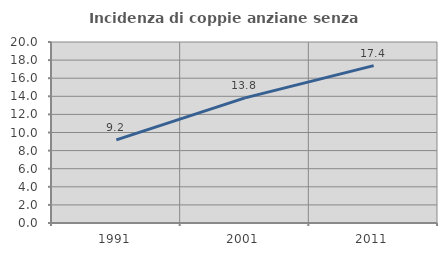
| Category | Incidenza di coppie anziane senza figli  |
|---|---|
| 1991.0 | 9.189 |
| 2001.0 | 13.825 |
| 2011.0 | 17.391 |